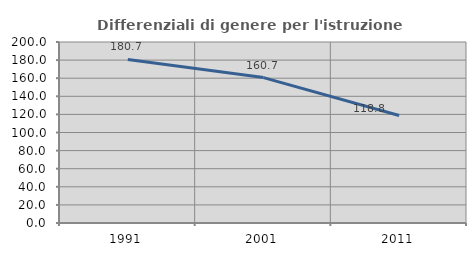
| Category | Differenziali di genere per l'istruzione superiore |
|---|---|
| 1991.0 | 180.675 |
| 2001.0 | 160.693 |
| 2011.0 | 118.796 |